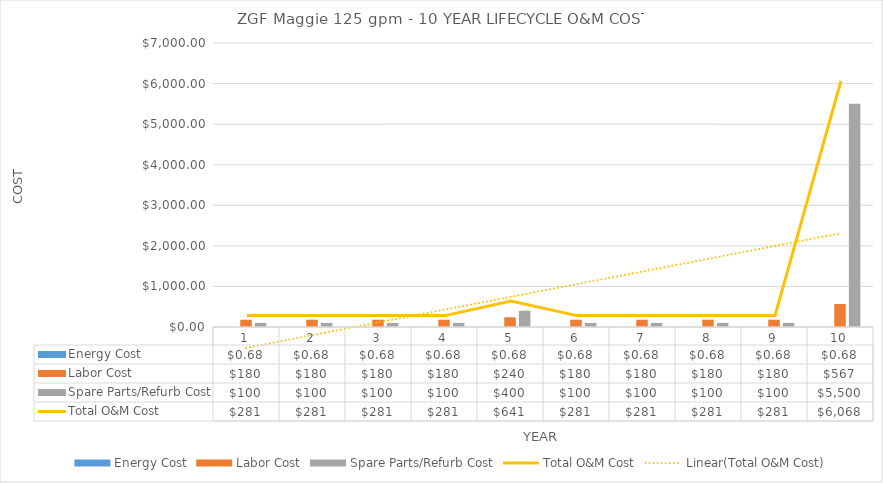
| Category | Energy Cost | Labor Cost | Spare Parts/Refurb Cost |
|---|---|---|---|
| 0 | 0.684 | 180 | 100 |
| 1 | 0.684 | 180 | 100 |
| 2 | 0.684 | 180 | 100 |
| 3 | 0.684 | 180 | 100 |
| 4 | 0.684 | 240 | 400 |
| 5 | 0.684 | 180 | 100 |
| 6 | 0.684 | 180 | 100 |
| 7 | 0.684 | 180 | 100 |
| 8 | 0.684 | 180 | 100 |
| 9 | 0.684 | 567 | 5500 |